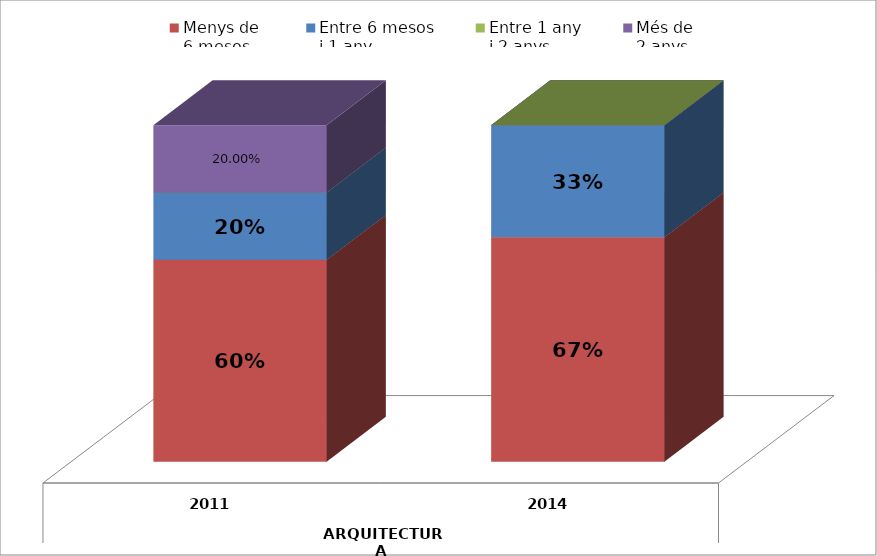
| Category | Menys de 
6 mesos | Entre 6 mesos
i 1 any | Entre 1 any
i 2 anys | Més de
2 anys |
|---|---|---|---|---|
| 0 | 0.6 | 0.2 | 0 | 0.2 |
| 1 | 0.667 | 0.333 | 0 | 0 |